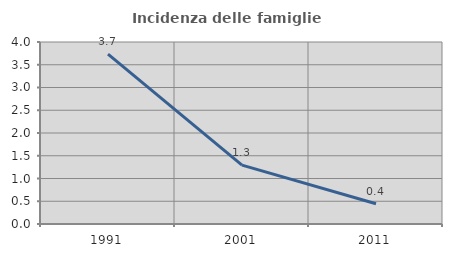
| Category | Incidenza delle famiglie numerose |
|---|---|
| 1991.0 | 3.734 |
| 2001.0 | 1.293 |
| 2011.0 | 0.444 |